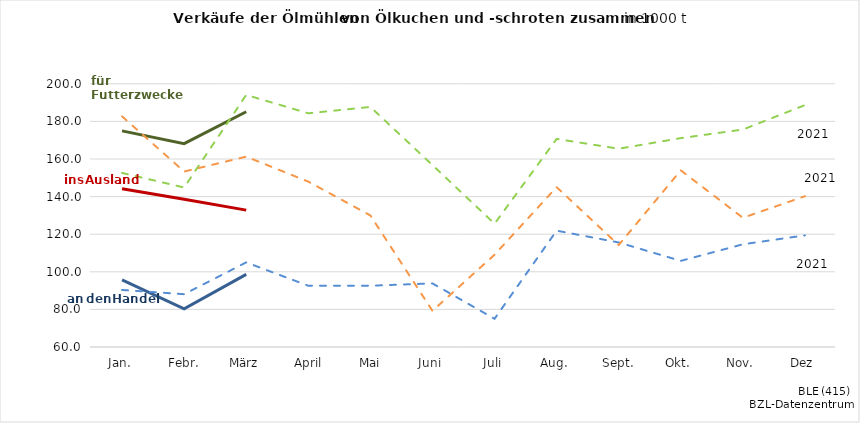
| Category | Verkauf für Futterzwecke | Verkauf an den Handel | Verkauf ins Ausland |
|---|---|---|---|
| Jan. | 152.61 | 90.352 | 182.678 |
|  Febr. | 144.83 | 88.091 | 153.325 |
| März | 194.081 | 105 | 161.259 |
|  April | 184.31 | 92.581 | 147.97 |
|  Mai | 187.704 | 92.595 | 129.971 |
| Juni | 156.768 | 93.834 | 79.226 |
| Juli | 125.563 | 75.001 | 109.096 |
| Aug. | 170.677 | 121.886 | 145.02 |
|  Sept. | 165.475 | 115.608 | 114.221 |
| Okt. | 171.105 | 105.818 | 153.965 |
| Nov. | 175.677 | 114.624 | 128.727 |
| Dez | 188.663 | 119.382 | 140.195 |